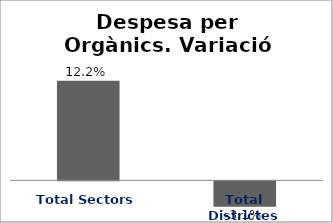
| Category | Series 0 |
|---|---|
| Total Sectors | 0.122 |
| Total Districtes | -0.031 |